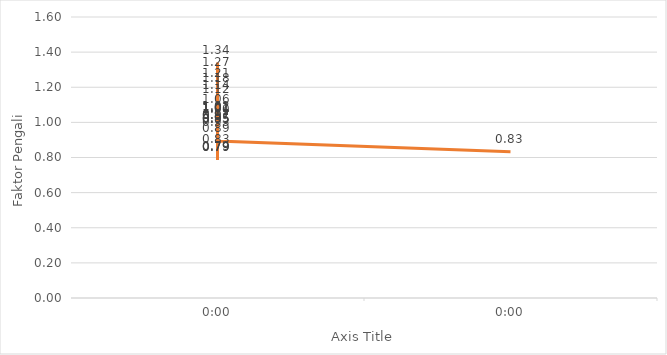
| Category | Faktor Pengali |
|---|---|
| 0.041666666666666664 | 0.793 |
| 0.08333333333333333 | 0.786 |
| 0.125 | 0.786 |
| 0.166666666666667 | 0.831 |
| 0.208333333333333 | 1.016 |
| 0.25 | 1.339 |
| 0.291666666666667 | 1.269 |
| 0.333333333333333 | 1.209 |
| 0.375 | 1.18 |
| 0.416666666666666 | 1.004 |
| 0.458333333333333 | 1.011 |
| 0.5 | 1.008 |
| 0.541666666666666 | 0.948 |
| 0.583333333333333 | 0.948 |
| 0.625 | 0.93 |
| 0.666666666666666 | 1.061 |
| 0.708333333333333 | 1.118 |
| 0.75 | 1.138 |
| 0.791666666666666 | 1.008 |
| 0.833333333333333 | 0.97 |
| 0.875 | 0.968 |
| 0.916666666666666 | 0.953 |
| 0.958333333333333 | 0.894 |
| 1900-01-01 | 0.832 |